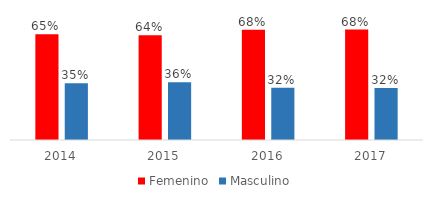
| Category | Femenino | Masculino |
|---|---|---|
| 2014.0 | 0.651 | 0.349 |
| 2015.0 | 0.644 | 0.356 |
| 2016.0 | 0.678 | 0.322 |
| 2017.0 | 0.68 | 0.32 |